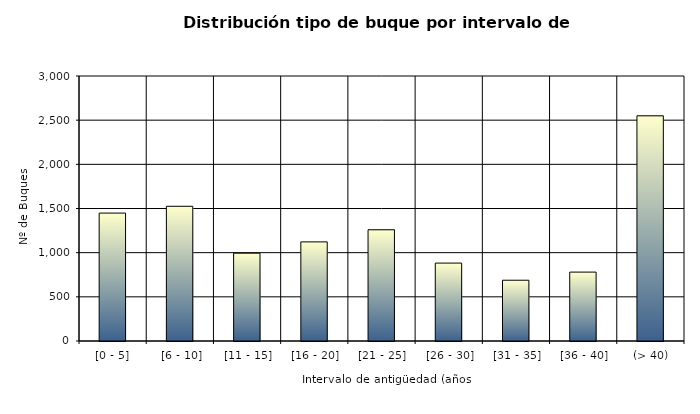
| Category | Series 0 |
|---|---|
| [0 - 5] | 1448 |
|  [6 - 10] | 1525 |
|  [11 - 15] | 994 |
|  [16 - 20] | 1122 |
|  [21 - 25] | 1259 |
|  [26 - 30] | 882 |
|  [31 - 35] | 688 |
|  [36 - 40] | 780 |
|  (> 40) | 2549 |